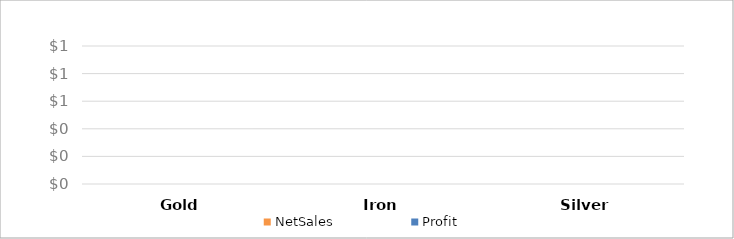
| Category | NetSales | Profit |
|---|---|---|
| Gold | 0 | 0 |
| Iron | 0 | 0 |
| Silver | 0 | 0 |